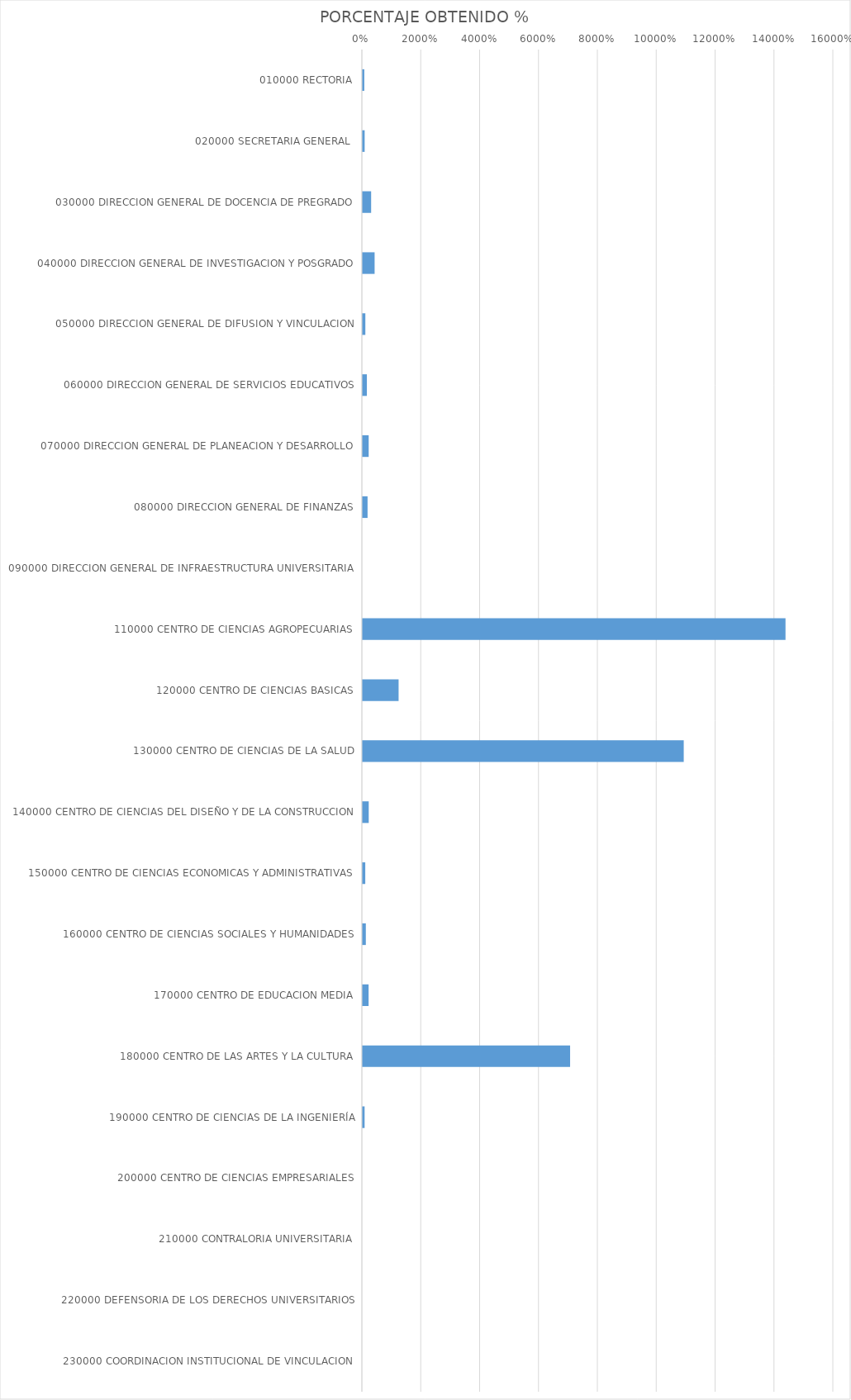
| Category | PORCENTAJE OBTENIDO % |
|---|---|
| 010000 RECTORIA | 0.542 |
| 020000 SECRETARIA GENERAL  | 0.662 |
| 030000 DIRECCION GENERAL DE DOCENCIA DE PREGRADO | 2.863 |
| 040000 DIRECCION GENERAL DE INVESTIGACION Y POSGRADO | 4.046 |
| 050000 DIRECCION GENERAL DE DIFUSION Y VINCULACION | 0.899 |
| 060000 DIRECCION GENERAL DE SERVICIOS EDUCATIVOS | 1.416 |
| 070000 DIRECCION GENERAL DE PLANEACION Y DESARROLLO | 2.029 |
| 080000 DIRECCION GENERAL DE FINANZAS | 1.648 |
| 090000 DIRECCION GENERAL DE INFRAESTRUCTURA UNIVERSITARIA | 0 |
| 110000 CENTRO DE CIENCIAS AGROPECUARIAS | 143.644 |
| 120000 CENTRO DE CIENCIAS BASICAS | 12.194 |
| 130000 CENTRO DE CIENCIAS DE LA SALUD | 109.07 |
| 140000 CENTRO DE CIENCIAS DEL DISEÑO Y DE LA CONSTRUCCION | 2.046 |
| 150000 CENTRO DE CIENCIAS ECONOMICAS Y ADMINISTRATIVAS | 0.869 |
| 160000 CENTRO DE CIENCIAS SOCIALES Y HUMANIDADES | 1.062 |
| 170000 CENTRO DE EDUCACION MEDIA | 1.997 |
| 180000 CENTRO DE LAS ARTES Y LA CULTURA | 70.463 |
| 190000 CENTRO DE CIENCIAS DE LA INGENIERÍA | 0.644 |
| 200000 CENTRO DE CIENCIAS EMPRESARIALES | 0 |
| 210000 CONTRALORIA UNIVERSITARIA | 0 |
| 220000 DEFENSORIA DE LOS DERECHOS UNIVERSITARIOS | 0 |
| 230000 COORDINACION INSTITUCIONAL DE VINCULACION | 0 |